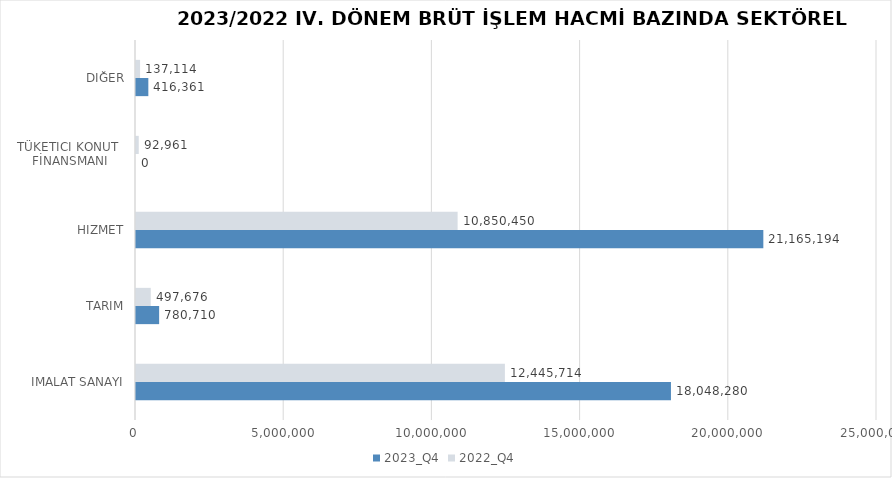
| Category | 2023_Q4 | 2022_Q4 |
|---|---|---|
| İMALAT SANAYİ | 18048280.115 | 12445714.012 |
| TARIM | 780710.371 | 497676.166 |
| HİZMET | 21165193.629 | 10850450.24 |
| TÜKETİCİ KONUT 
FİNANSMANI | 0 | 92961 |
| DİĞER | 416361 | 137114 |